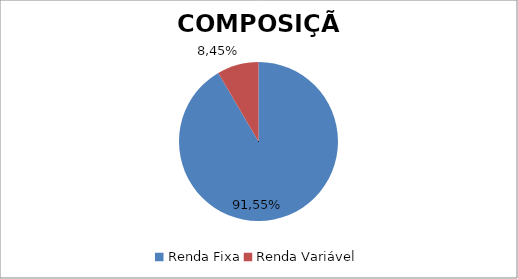
| Category | Series 0 |
|---|---|
| Renda Fixa | 0.915 |
| Renda Variável | 0.085 |